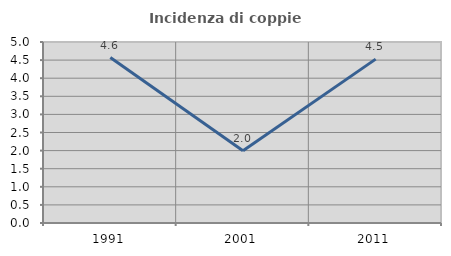
| Category | Incidenza di coppie miste |
|---|---|
| 1991.0 | 4.571 |
| 2001.0 | 1.993 |
| 2011.0 | 4.527 |